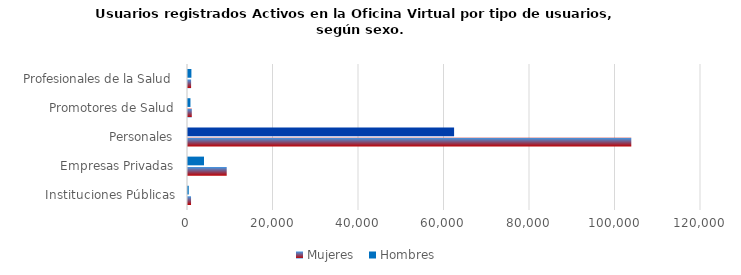
| Category | Mujeres | Hombres |
|---|---|---|
| Instituciones Públicas | 711 | 174 |
| Empresas Privadas | 9056 | 3743 |
| Personales | 103696 | 62244 |
| Promotores de Salud | 888 | 573 |
| Profesionales de la Salud | 725 | 796 |